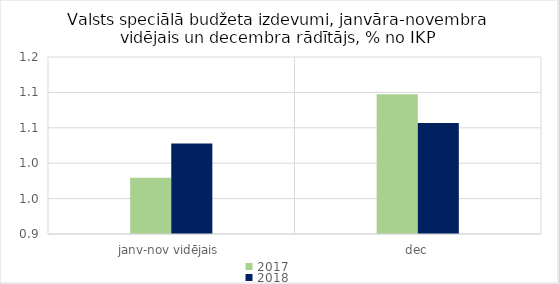
| Category | 2017 | 2018 |
|---|---|---|
| janv-nov vidējais | 0.98 | 1.028 |
| dec | 1.097 | 1.057 |